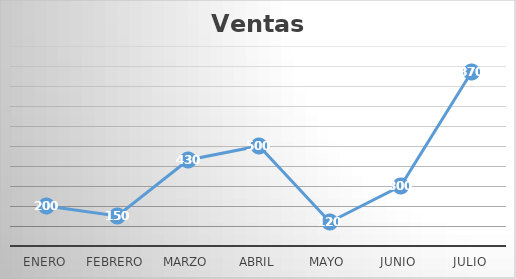
| Category | Ventas |
|---|---|
| Enero | 200 |
| Febrero | 150 |
| Marzo | 430 |
| Abril | 500 |
| Mayo | 120 |
| Junio | 300 |
| Julio | 870 |